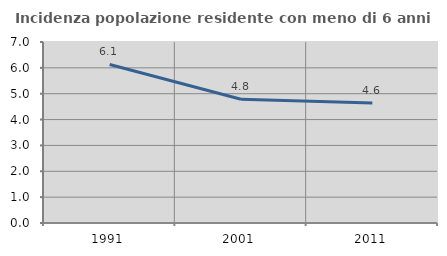
| Category | Incidenza popolazione residente con meno di 6 anni |
|---|---|
| 1991.0 | 6.131 |
| 2001.0 | 4.784 |
| 2011.0 | 4.636 |